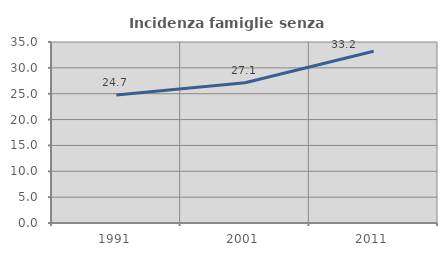
| Category | Incidenza famiglie senza nuclei |
|---|---|
| 1991.0 | 24.735 |
| 2001.0 | 27.106 |
| 2011.0 | 33.212 |